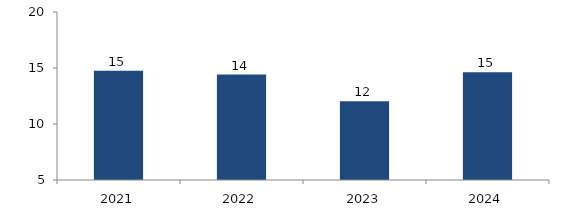
| Category | Bogotá |
|---|---|
| 2021.0 | 14.757 |
| 2022.0 | 14.41 |
| 2023.0 | 12.037 |
| 2024.0 | 14.611 |